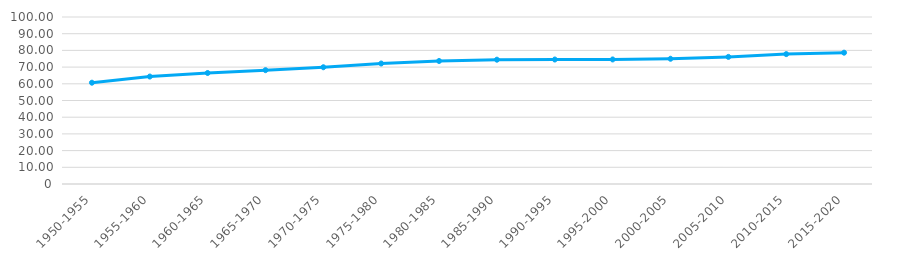
| Category | Curaçao |
|---|---|
| 1950-1955 | 60.653 |
| 1955-1960 | 64.343 |
| 1960-1965 | 66.475 |
| 1965-1970 | 68.163 |
| 1970-1975 | 69.912 |
| 1975-1980 | 72.154 |
| 1980-1985 | 73.66 |
| 1985-1990 | 74.436 |
| 1990-1995 | 74.543 |
| 1995-2000 | 74.579 |
| 2000-2005 | 74.995 |
| 2005-2010 | 76.118 |
| 2010-2015 | 77.774 |
| 2015-2020 | 78.631 |